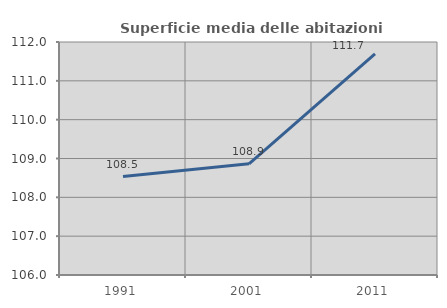
| Category | Superficie media delle abitazioni occupate |
|---|---|
| 1991.0 | 108.536 |
| 2001.0 | 108.862 |
| 2011.0 | 111.692 |